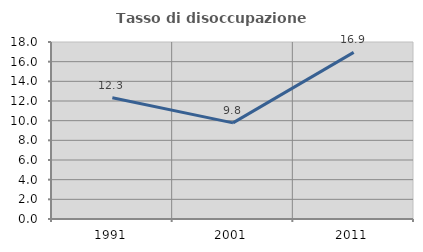
| Category | Tasso di disoccupazione giovanile  |
|---|---|
| 1991.0 | 12.329 |
| 2001.0 | 9.774 |
| 2011.0 | 16.949 |